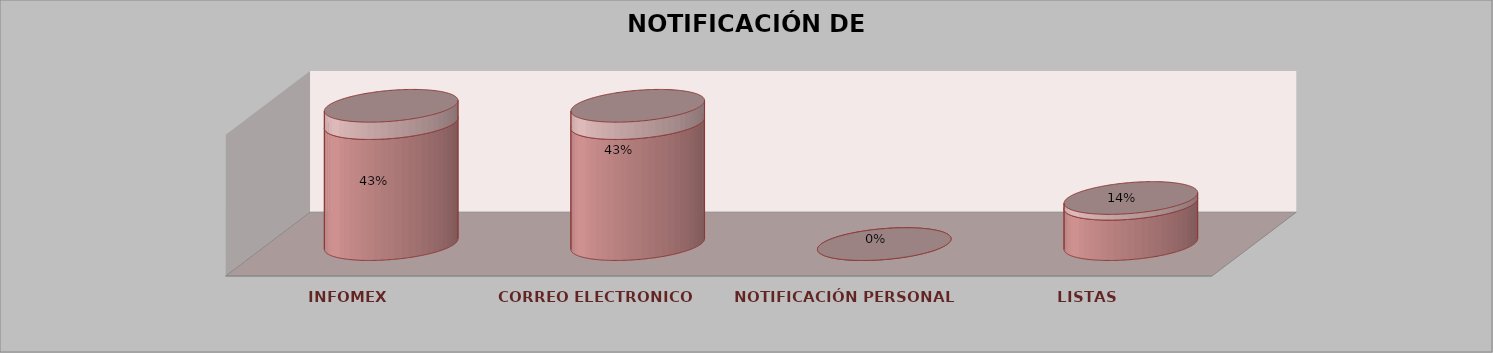
| Category | Series 0 | Series 1 | Series 2 | Series 3 | Series 4 |
|---|---|---|---|---|---|
| INFOMEX |  |  |  | 3 | 0.429 |
| CORREO ELECTRONICO |  |  |  | 3 | 0.429 |
| NOTIFICACIÓN PERSONAL |  |  |  | 0 | 0 |
| LISTAS |  |  |  | 1 | 0.143 |